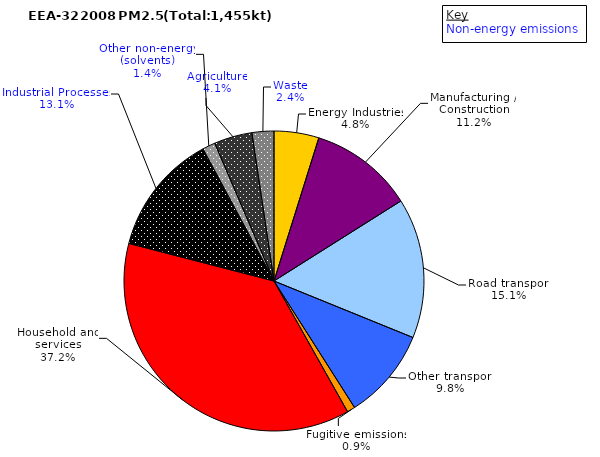
| Category | Series 0 |
|---|---|
| Energy Industries | 70.099 |
| Manufacturing / Construction | 162.724 |
| Road transport | 219.163 |
| Other transport | 142.576 |
| Fugitive emissions | 12.561 |
| Household and services | 539.663 |
| Industrial Processes | 190.287 |
| Other non-energy (solvents) | 20.15 |
| Agriculture | 59.561 |
| Waste | 34.247 |